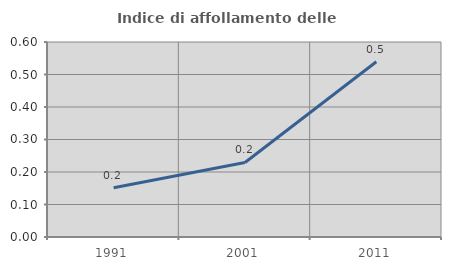
| Category | Indice di affollamento delle abitazioni  |
|---|---|
| 1991.0 | 0.152 |
| 2001.0 | 0.229 |
| 2011.0 | 0.539 |